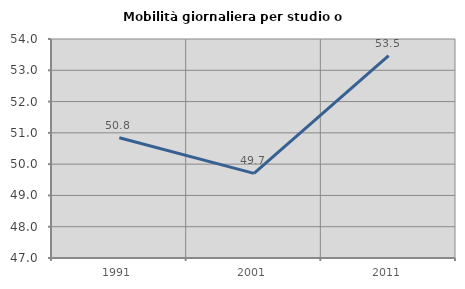
| Category | Mobilità giornaliera per studio o lavoro |
|---|---|
| 1991.0 | 50.845 |
| 2001.0 | 49.706 |
| 2011.0 | 53.468 |